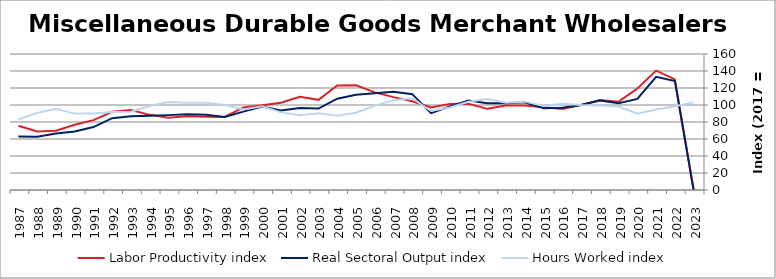
| Category | Labor Productivity index | Real Sectoral Output index | Hours Worked index |
|---|---|---|---|
| 2023.0 | 0 | 0 | 103.096 |
| 2022.0 | 130.144 | 128.104 | 98.432 |
| 2021.0 | 140.454 | 133.071 | 94.744 |
| 2020.0 | 119.419 | 107.15 | 89.726 |
| 2019.0 | 103.9 | 102.015 | 98.185 |
| 2018.0 | 105.901 | 105.14 | 99.281 |
| 2017.0 | 100 | 100 | 100 |
| 2016.0 | 95.335 | 96.68 | 101.411 |
| 2015.0 | 97.486 | 96.298 | 98.781 |
| 2014.0 | 99.305 | 103.222 | 103.944 |
| 2013.0 | 99.539 | 102.121 | 102.594 |
| 2012.0 | 95.479 | 102.19 | 107.029 |
| 2011.0 | 101.55 | 105.324 | 103.716 |
| 2010.0 | 101.188 | 98.188 | 97.035 |
| 2009.0 | 97.219 | 90.371 | 92.956 |
| 2008.0 | 104.361 | 112.742 | 108.031 |
| 2007.0 | 109.282 | 115.515 | 105.703 |
| 2006.0 | 114.832 | 113.797 | 99.099 |
| 2005.0 | 123.114 | 111.962 | 90.941 |
| 2004.0 | 123.009 | 107.4 | 87.311 |
| 2003.0 | 106.078 | 95.819 | 90.329 |
| 2002.0 | 109.583 | 96.507 | 88.068 |
| 2001.0 | 102.573 | 93.655 | 91.306 |
| 2000.0 | 99.714 | 98.143 | 98.424 |
| 1999.0 | 97.195 | 92.193 | 94.854 |
| 1998.0 | 85.904 | 85.897 | 99.991 |
| 1997.0 | 86.199 | 88.606 | 102.792 |
| 1996.0 | 86.8 | 89.132 | 102.686 |
| 1995.0 | 85.054 | 88.087 | 103.567 |
| 1994.0 | 88.411 | 87.411 | 98.869 |
| 1993.0 | 94.056 | 86.698 | 92.177 |
| 1992.0 | 92.07 | 84.525 | 91.805 |
| 1991.0 | 82.154 | 74.009 | 90.086 |
| 1990.0 | 76.699 | 68.934 | 89.876 |
| 1989.0 | 69.621 | 66.521 | 95.546 |
| 1988.0 | 68.96 | 62.521 | 90.662 |
| 1987.0 | 75.654 | 62.896 | 83.136 |